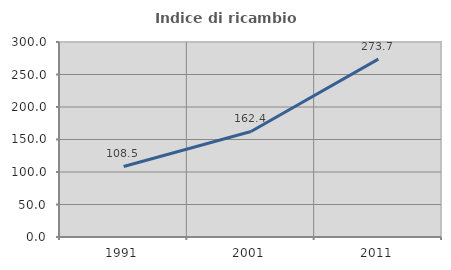
| Category | Indice di ricambio occupazionale  |
|---|---|
| 1991.0 | 108.468 |
| 2001.0 | 162.387 |
| 2011.0 | 273.684 |